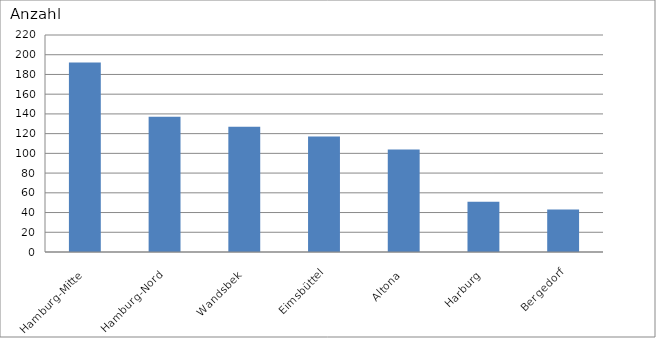
| Category | Hamburg-Mitte |
|---|---|
| Hamburg-Mitte | 192 |
| Hamburg-Nord | 137 |
| Wandsbek | 127 |
| Eimsbüttel | 117 |
| Altona | 104 |
| Harburg | 51 |
| Bergedorf | 43 |